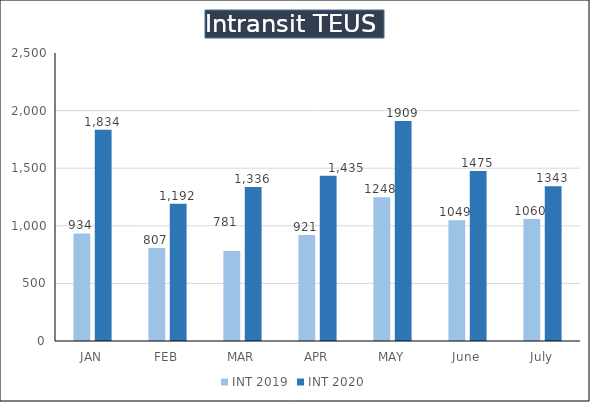
| Category | INT 2019 | INT 2020 |
|---|---|---|
| JAN | 934 | 1834 |
| FEB | 807 | 1192 |
| MAR | 781 | 1336 |
| APR | 921 | 1435 |
| MAY | 1248 | 1909 |
| June | 1049 | 1475 |
| July | 1060 | 1343 |